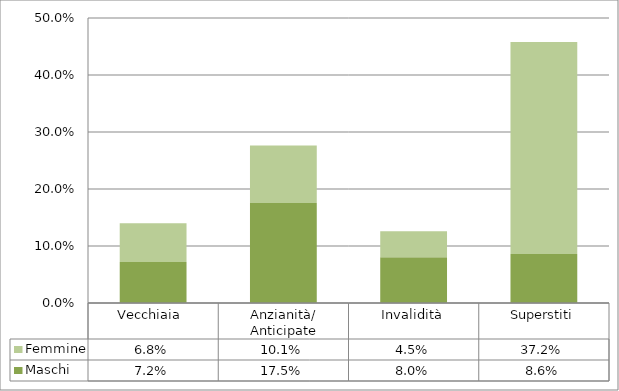
| Category | Maschi | Femmine |
|---|---|---|
| Vecchiaia  | 0.072 | 0.068 |
| Anzianità/ Anticipate | 0.175 | 0.101 |
| Invalidità | 0.08 | 0.045 |
| Superstiti | 0.086 | 0.372 |